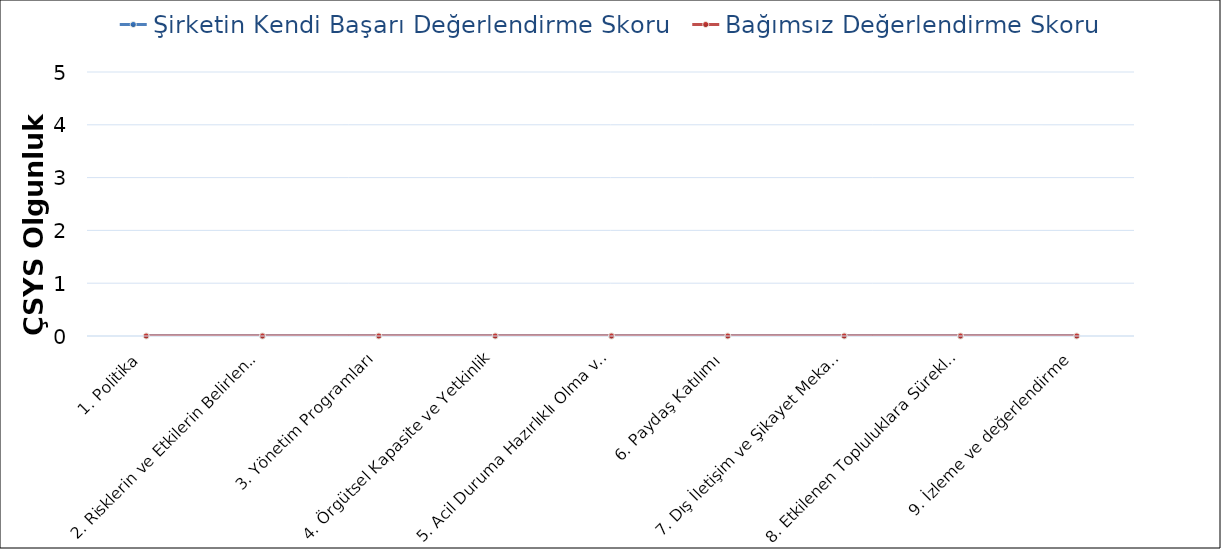
| Category | Şirketin Kendi Başarı Değerlendirme Skoru | Bağımsız Değerlendirme Skoru |
|---|---|---|
| 1. Politika | 0 | 0 |
| 2. Risklerin ve Etkilerin Belirlenmesi | 0 | 0 |
| 3. Yönetim Programları | 0 | 0 |
| 4. Örgütsel Kapasite ve Yetkinlik | 0 | 0 |
| 5. Acil Duruma Hazırlıklı Olma ve Müdahale | 0 | 0 |
| 6. Paydaş Katılımı | 0 | 0 |
| 7. Dış İletişim ve Şikayet Mekanizmaları | 0 | 0 |
| 8. Etkilenen Topluluklara Sürekli Raporlama | 0 | 0 |
| 9. İzleme ve değerlendirme | 0 | 0 |